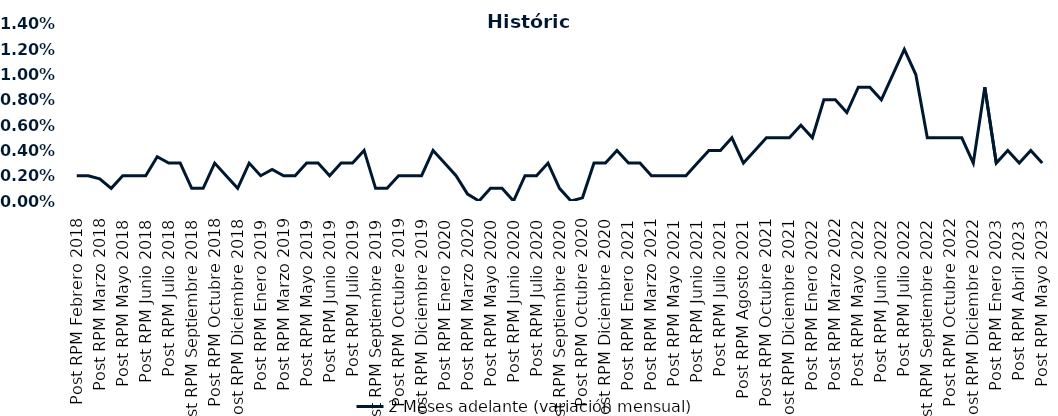
| Category | 2 Meses adelante (variación mensual) |
|---|---|
| Post RPM Febrero 2018 | 0.002 |
| Pre RPM Marzo 2018 | 0.002 |
| Post RPM Marzo 2018 | 0.002 |
| Pre RPM Mayo 2018 | 0.001 |
| Post RPM Mayo 2018 | 0.002 |
| Pre RPM Junio 2018 | 0.002 |
| Post RPM Junio 2018 | 0.002 |
| Pre RPM Julio 2018 | 0.004 |
| Post RPM Julio 2018 | 0.003 |
| Pre RPM Septiembre 2018 | 0.003 |
| Post RPM Septiembre 2018 | 0.001 |
| Pre RPM Octubre 2018 | 0.001 |
| Post RPM Octubre 2018 | 0.003 |
| Pre RPM Diciembre 2018 | 0.002 |
| Post RPM Diciembre 2018 | 0.001 |
| Pre RPM Enero 2019 | 0.003 |
| Post RPM Enero 2019 | 0.002 |
| Pre RPM Marzo 2019 | 0.002 |
| Post RPM Marzo 2019 | 0.002 |
| Pre RPM Mayo 2019 | 0.002 |
| Post RPM Mayo 2019 | 0.003 |
| Pre RPM Junio 2019 | 0.003 |
| Post RPM Junio 2019 | 0.002 |
| Pre RPM Julio 2019 | 0.003 |
| Post RPM Julio 2019 | 0.003 |
| Pre RPM Septiembre 2019 | 0.004 |
| Post RPM Septiembre 2019 | 0.001 |
| Pre RPM Octubre 2019 | 0.001 |
| Post RPM Octubre 2019 | 0.002 |
| Pre RPM Diciembre 2019 | 0.002 |
| Post RPM Diciembre 2019 | 0.002 |
| Pre RPM Enero 2020 | 0.004 |
| Post RPM Enero 2020 | 0.003 |
| Pre RPM Marzo 2020 | 0.002 |
| Post RPM Marzo 2020 | 0.001 |
| Pre RPM Mayo 2020 | 0 |
| Post RPM Mayo 2020 | 0.001 |
| Pre RPM Junio 2020 | 0.001 |
| Post RPM Junio 2020 | 0 |
| Pre RPM Julio 2020 | 0.002 |
| Post RPM Julio 2020 | 0.002 |
| Pre RPM Septiembre 2020 | 0.003 |
| Post RPM Septiembre 2020 | 0.001 |
| Pre RPM Octubre 2020 | 0 |
| Post RPM Octubre 2020 | 0 |
| Pre RPM Diciembre 2020 | 0.003 |
| Post RPM Diciembre 2020 | 0.003 |
| Pre RPM Enero 2021 | 0.004 |
| Post RPM Enero 2021 | 0.003 |
| Pre RPM Marzo 2021 | 0.003 |
| Post RPM Marzo 2021 | 0.002 |
| Pre RPM Mayo 2021 | 0.002 |
| Post RPM Mayo 2021 | 0.002 |
| Pre RPM Junio 2021 | 0.002 |
| Post RPM Junio 2021 | 0.003 |
| Pre RPM Julio 2021 | 0.004 |
| Post RPM Julio 2021 | 0.004 |
| Pre RPM Agosto 2021 | 0.005 |
| Post RPM Agosto 2021 | 0.003 |
| Pre RPM Octubre 2021 | 0.004 |
| Post RPM Octubre 2021 | 0.005 |
| Pre RPM Diciembre 2021 | 0.005 |
| Post RPM Diciembre 2021 | 0.005 |
| Pre RPM Enero 2022 | 0.006 |
| Post RPM Enero 2022 | 0.005 |
| Pre RPM Marzo 2022 | 0.008 |
| Post RPM Marzo 2022 | 0.008 |
| Pre RPM Mayo 2022 | 0.007 |
| Post RPM Mayo 2022 | 0.009 |
| Pre RPM Junio 2022 | 0.009 |
| Post RPM Junio 2022 | 0.008 |
| Pre RPM Julio 2022 | 0.01 |
| Post RPM Julio 2022 | 0.012 |
| Pre RPM Septiembre 2022 | 0.01 |
| Post RPM Septiembre 2022 | 0.005 |
| Pre RPM Octubre 2022 | 0.005 |
| Post RPM Octubre 2022 | 0.005 |
| Pre RPM Diciembre 2022 | 0.005 |
| Post RPM Diciembre 2022 | 0.003 |
| Pre RPM Enero 2023 | 0.009 |
| Post RPM Enero 2023 | 0.003 |
| Pre RPM Abril 2023 | 0.004 |
| Post RPM Abril 2023 | 0.003 |
| Pre RPM Mayo 2023 | 0.004 |
| Post RPM Mayo 2023 | 0.003 |